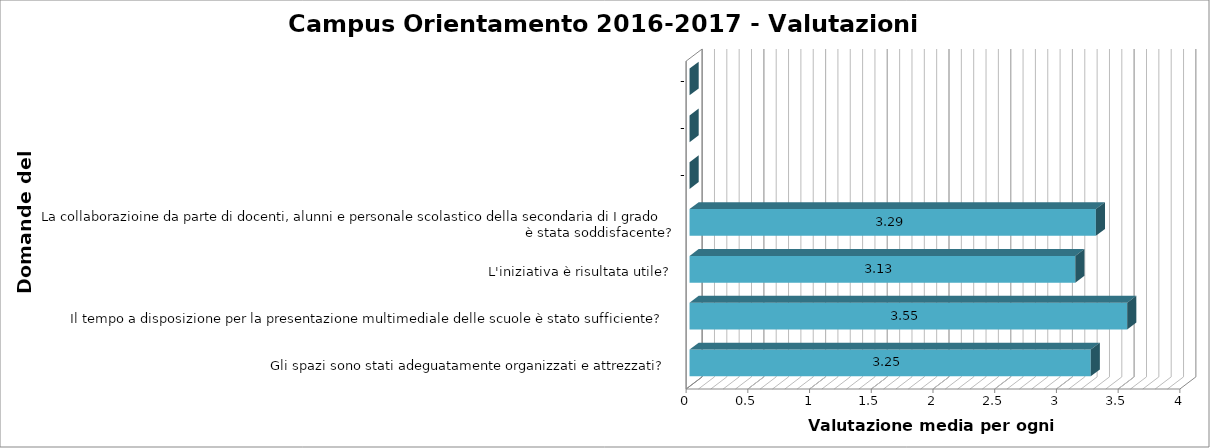
| Category | Series 0 | Series 1 | Series 2 | Series 3 | Series 4 |
|---|---|---|---|---|---|
| Gli spazi sono stati adeguatamente organizzati e attrezzati? |  |  |  |  | 3.25 |
| Il tempo a disposizione per la presentazione multimediale delle scuole è stato sufficiente? |  |  |  |  | 3.545 |
| L'iniziativa è risultata utile? |  |  |  |  | 3.125 |
| La collaborazioine da parte di docenti, alunni e personale scolastico della secondaria di I grado è stata soddisfacente? |  |  |  |  | 3.292 |